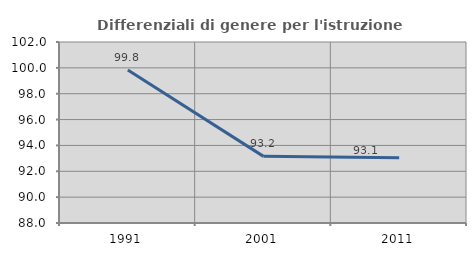
| Category | Differenziali di genere per l'istruzione superiore |
|---|---|
| 1991.0 | 99.827 |
| 2001.0 | 93.154 |
| 2011.0 | 93.05 |